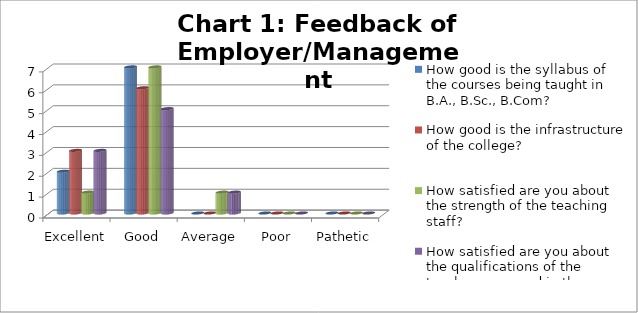
| Category | How good is the syllabus of the courses being taught in B.A., B.Sc., B.Com? | How good is the infrastructure of the college? | How satisfied are you about the strength of the teaching staff? | How satisfied are you about the qualifications of the teachers engaged in the college? |
|---|---|---|---|---|
| Excellent | 2 | 3 | 1 | 3 |
| Good | 7 | 6 | 7 | 5 |
| Average | 0 | 0 | 1 | 1 |
| Poor | 0 | 0 | 0 | 0 |
| Pathetic | 0 | 0 | 0 | 0 |